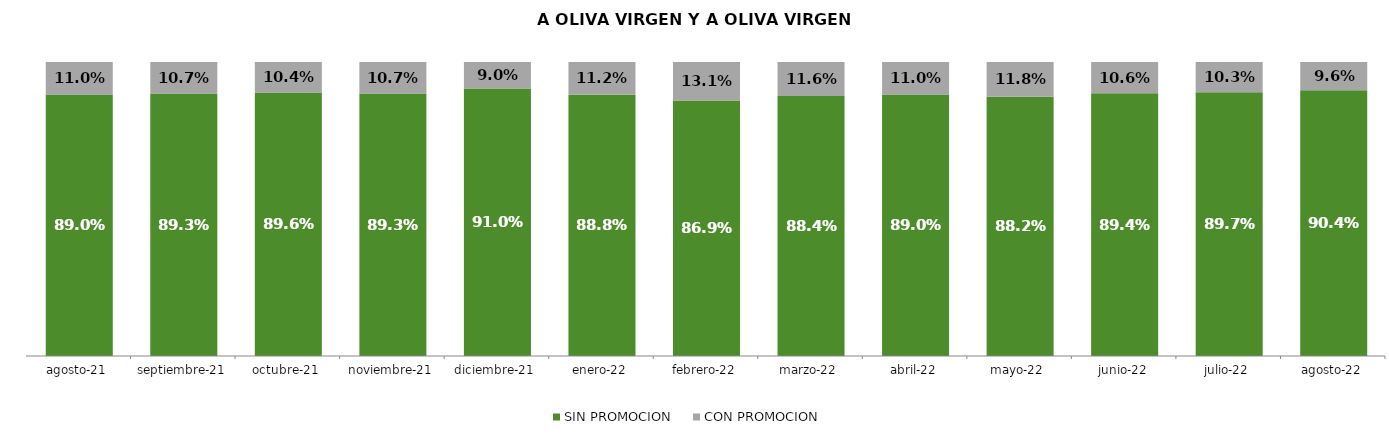
| Category | SIN PROMOCION   | CON PROMOCION   |
|---|---|---|
| 2021-08-01 | 0.89 | 0.11 |
| 2021-09-01 | 0.893 | 0.107 |
| 2021-10-01 | 0.896 | 0.104 |
| 2021-11-01 | 0.893 | 0.107 |
| 2021-12-01 | 0.91 | 0.09 |
| 2022-01-01 | 0.888 | 0.112 |
| 2022-02-01 | 0.869 | 0.131 |
| 2022-03-01 | 0.884 | 0.116 |
| 2022-04-01 | 0.89 | 0.11 |
| 2022-05-01 | 0.882 | 0.118 |
| 2022-06-01 | 0.894 | 0.106 |
| 2022-07-01 | 0.897 | 0.103 |
| 2022-08-01 | 0.904 | 0.096 |